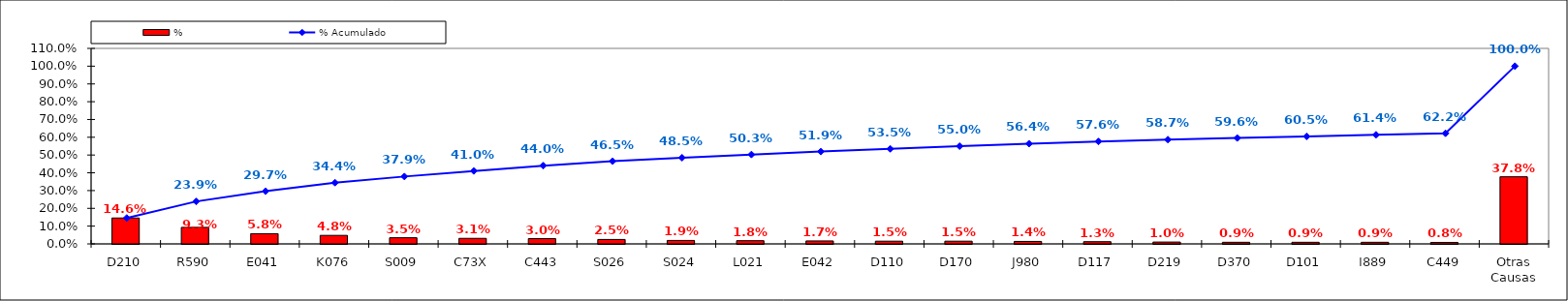
| Category | % |
|---|---|
| D210 | 0.146 |
| R590 | 0.093 |
| E041 | 0.058 |
| K076 | 0.048 |
| S009 | 0.035 |
| C73X | 0.031 |
| C443 | 0.03 |
| S026 | 0.025 |
| S024 | 0.019 |
| L021 | 0.018 |
| E042 | 0.017 |
| D110 | 0.015 |
| D170 | 0.015 |
| J980 | 0.014 |
| D117 | 0.012 |
| D219 | 0.01 |
| D370 | 0.009 |
| D101 | 0.009 |
| I889 | 0.009 |
| C449 | 0.008 |
| Otras Causas | 0.378 |